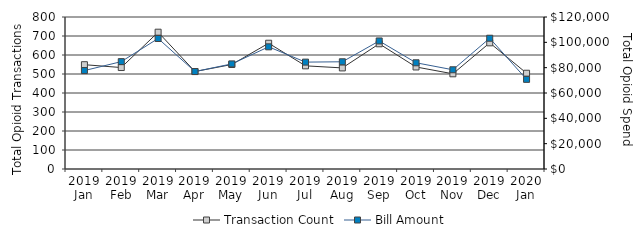
| Category | Transaction Count |
|---|---|
| 2019 Jan | 549 |
| 2019 Feb | 534 |
| 2019 Mar | 720 |
| 2019 Apr | 513 |
| 2019 May | 550 |
| 2019 Jun | 662 |
| 2019 Jul | 543 |
| 2019 Aug | 532 |
| 2019 Sep | 659 |
| 2019 Oct | 537 |
| 2019 Nov | 501 |
| 2019 Dec | 664 |
| 2020 Jan | 504 |